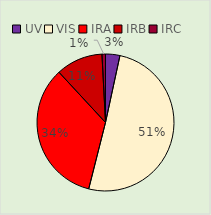
| Category | Series 0 |
|---|---|
| UV | 0.034 |
| VIS | 0.506 |
| IRA | 0.342 |
| IRB | 0.111 |
| IRC | 0.008 |